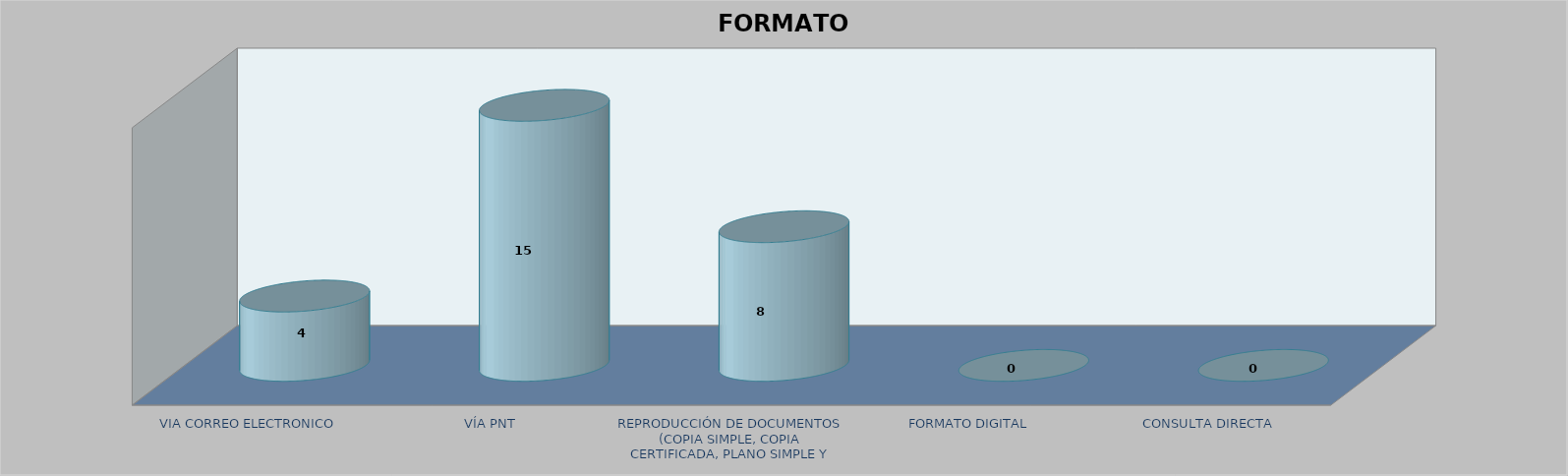
| Category |        FORMATO SOLICITADO | Series 1 | Series 2 |
|---|---|---|---|
| VIA CORREO ELECTRONICO |  |  | 4 |
| VÍA PNT |  |  | 15 |
| REPRODUCCIÓN DE DOCUMENTOS (COPIA SIMPLE, COPIA CERTIFICADA, PLANO SIMPLE Y PLANO CERTIFICADO) |  |  | 8 |
| FORMATO DIGITAL |  |  | 0 |
| CONSULTA DIRECTA |  |  | 0 |